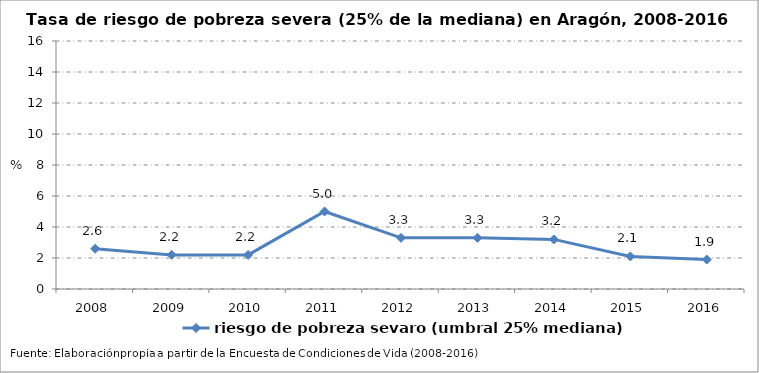
| Category | riesgo de pobreza sevaro (umbral 25% mediana) |
|---|---|
| 2008.0 | 2.6 |
| 2009.0 | 2.2 |
| 2010.0 | 2.2 |
| 2011.0 | 5 |
| 2012.0 | 3.3 |
| 2013.0 | 3.3 |
| 2014.0 | 3.2 |
| 2015.0 | 2.1 |
| 2016.0 | 1.9 |